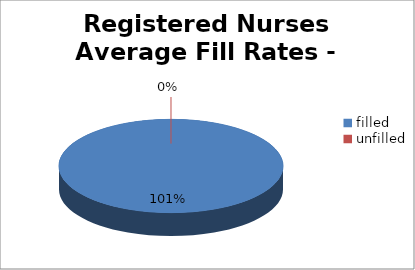
| Category | Series 0 |
|---|---|
| filled  | 101 |
| unfilled | 0 |